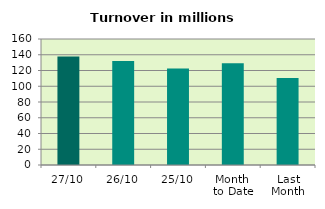
| Category | Series 0 |
|---|---|
| 27/10 | 137.928 |
| 26/10 | 131.912 |
| 25/10 | 122.509 |
| Month 
to Date | 129.151 |
| Last
Month | 110.611 |